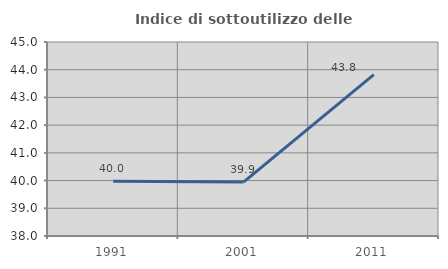
| Category | Indice di sottoutilizzo delle abitazioni  |
|---|---|
| 1991.0 | 39.973 |
| 2001.0 | 39.945 |
| 2011.0 | 43.82 |